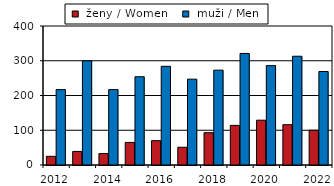
| Category |  ženy / Women  |  muži / Men |
|---|---|---|
| 2012.0 | 25 | 217 |
| 2013.0 | 39 | 300 |
| 2014.0 | 33 | 217 |
| 2015.0 | 65 | 254 |
| 2016.0 | 70 | 284 |
| 2017.0 | 51 | 247 |
| 2018.0 | 93 | 273 |
| 2019.0 | 114 | 321 |
| 2020.0 | 129 | 286 |
| 2021.0 | 116 | 313 |
| 2022.0 | 100 | 269 |